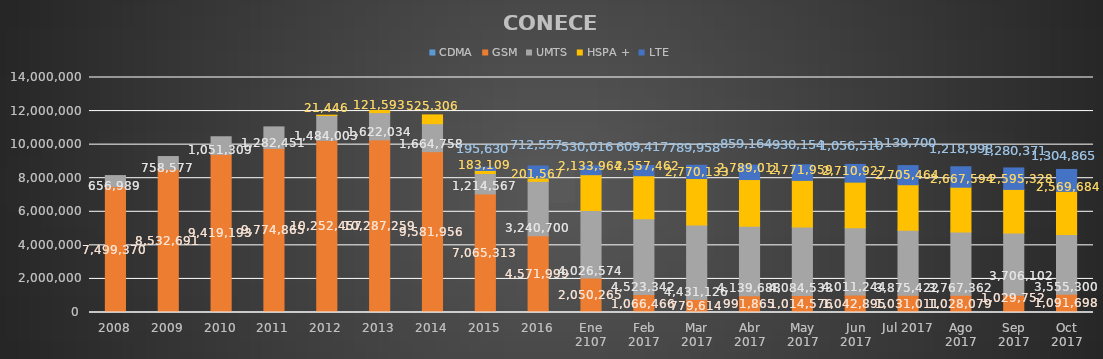
| Category | CDMA | GSM | UMTS | HSPA + | LTE |
|---|---|---|---|---|---|
| 2008 | 0 | 7499370 | 656989 | 0 | 0 |
| 2009 | 0 | 8532691 | 758577 | 0 | 0 |
| 2010 | 0 | 9419193 | 1051309 | 0 | 0 |
| 2011 | 0 | 9774865 | 1282451 | 0 | 0 |
| 2012 | 0 | 10252457 | 1484003 | 21446 | 0 |
| 2013 | 0 | 10287259 | 1622034 | 121593 | 0 |
| 2014 | 0 | 9581956 | 1664758 | 525306 | 0 |
| 2015 | 0 | 7065313 | 1214567 | 183109 | 195630 |
| 2016 | 0 | 4571999 | 3240700 | 201567 | 712557 |
| Ene 2107 | 0 | 2050264.931 | 4026574 | 2133964 | 530016 |
| Feb 2017 | 0 | 1066466 | 4523342 | 2557462 | 609417 |
| Mar 2017 | 0 | 779614 | 4431126 | 2770133 | 789958 |
| Abr 2017 | 0 | 991865 | 4139688 | 2789011 | 859164 |
| May 2017 | 0 | 1014576 | 4084533 | 2771959 | 930154 |
| Jun 2017 | 0 | 1042895 | 4011244 | 2710927 | 1056510 |
| Jul 2017 | 0 | 1031011 | 3875422 | 2705464 | 1139700 |
| Ago 2017 | 0 | 1028079 | 3767362 | 2667594 | 1218998 |
| Sep 2017 | 0 | 1029752 | 3706102 | 2595328 | 1280371 |
| Oct 2017 | 0 | 1091698 | 3555300 | 2569684 | 1304865 |